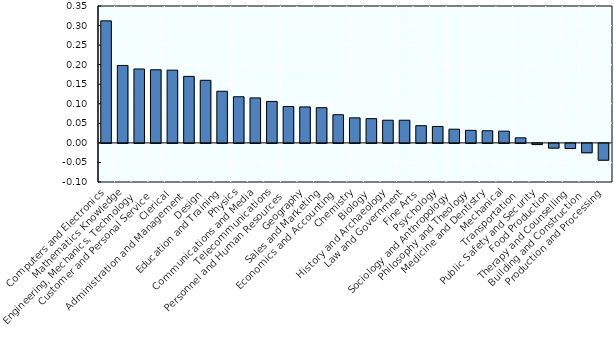
| Category | Skill needs |
|---|---|
| Computers and Electronics | 0.312 |
| Mathematics Knowledge | 0.198 |
| Engineering, Mechanics, Technology | 0.189 |
| Customer and Personal Service | 0.187 |
| Clerical | 0.186 |
| Administration and Management | 0.17 |
| Design | 0.16 |
| Education and Training | 0.132 |
| Physics | 0.118 |
| Communications and Media | 0.115 |
| Telecommunications | 0.106 |
| Personnel and Human Resources | 0.093 |
| Geography | 0.092 |
| Sales and Marketing | 0.09 |
| Economics and Accounting | 0.072 |
| Chemistry | 0.064 |
| Biology | 0.062 |
| History and Archaeology | 0.058 |
| Law and Government | 0.058 |
| Fine Arts | 0.044 |
| Psychology | 0.042 |
| Sociology and Anthropology | 0.035 |
| Philosophy and Theology | 0.032 |
| Medicine and Dentistry | 0.031 |
| Mechanical | 0.03 |
| Transportation | 0.013 |
| Public Safety and Security | -0.003 |
| Food Production | -0.012 |
| Therapy and Counselling | -0.013 |
| Building and Construction | -0.024 |
| Production and Processing | -0.043 |